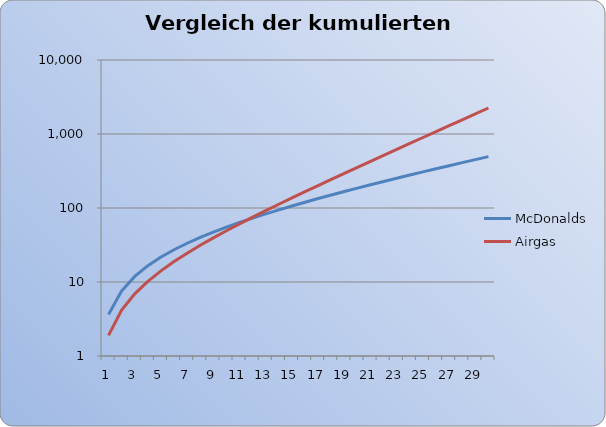
| Category | McDonalds | Airgas |
|---|---|---|
| 0 | 3.63 | 1.9 |
| 1 | 7.587 | 4.18 |
| 2 | 11.9 | 6.916 |
| 3 | 16.6 | 10.199 |
| 4 | 21.724 | 14.139 |
| 5 | 27.31 | 18.867 |
| 6 | 33.398 | 24.54 |
| 7 | 40.033 | 31.348 |
| 8 | 47.266 | 39.518 |
| 9 | 55.15 | 49.321 |
| 10 | 63.744 | 61.086 |
| 11 | 73.111 | 75.203 |
| 12 | 83.321 | 92.144 |
| 13 | 94.45 | 112.472 |
| 14 | 106.58 | 136.867 |
| 15 | 119.802 | 166.14 |
| 16 | 134.215 | 201.268 |
| 17 | 149.924 | 243.422 |
| 18 | 167.047 | 294.006 |
| 19 | 185.711 | 354.707 |
| 20 | 206.055 | 427.549 |
| 21 | 228.23 | 514.958 |
| 22 | 252.401 | 619.85 |
| 23 | 278.747 | 745.72 |
| 24 | 307.464 | 896.764 |
| 25 | 338.766 | 1078.017 |
| 26 | 372.885 | 1295.52 |
| 27 | 410.075 | 1556.524 |
| 28 | 450.611 | 1869.729 |
| 29 | 494.796 | 2245.575 |